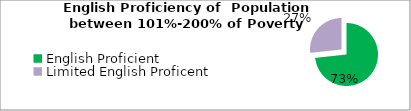
| Category | Percent |
|---|---|
| English Proficient | 0.733 |
| Limited English Proficent | 0.267 |